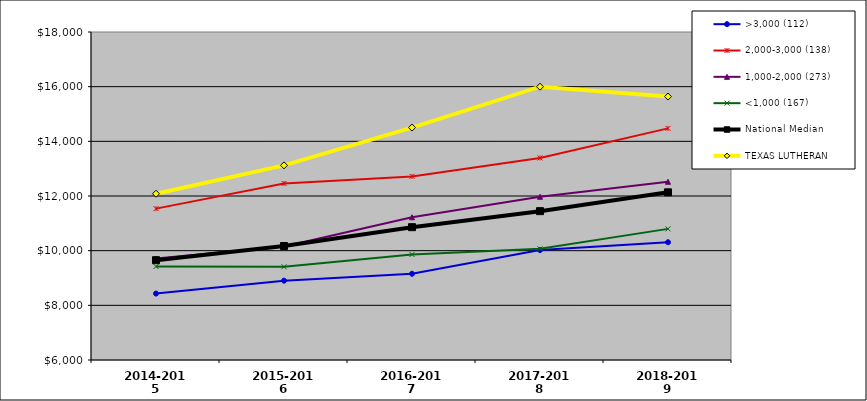
| Category | >3,000 (112) | 2,000-3,000 (138) | 1,000-2,000 (273) | <1,000 (167) | National Median | TEXAS LUTHERAN |
|---|---|---|---|---|---|---|
| 2014-2015 | 8430.292 | 11538.343 | 9713.097 | 9419.133 | 9651.331 | 12082.598 |
| 2015-2016 | 8902.347 | 12458.375 | 10155.348 | 9411.233 | 10170.953 | 13120.524 |
| 2016-2017 | 9154.326 | 12716.521 | 11221.654 | 9859.975 | 10859.41 | 14503.602 |
| 2017-2018 | 10021.52 | 13392.762 | 11971.115 | 10066.834 | 11445.61 | 15999.237 |
| 2018-2019 | 10308.755 | 14473.529 | 12520.546 | 10797.607 | 12133.725 | 15639.308 |